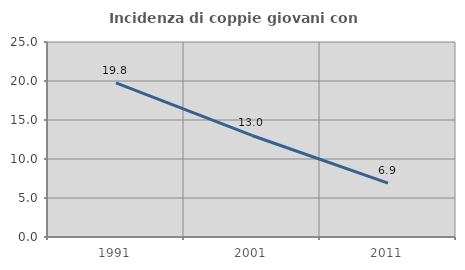
| Category | Incidenza di coppie giovani con figli |
|---|---|
| 1991.0 | 19.757 |
| 2001.0 | 13.018 |
| 2011.0 | 6.906 |